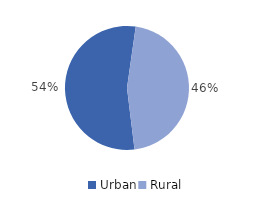
| Category | Series 0 |
|---|---|
| Urban | 54.2 |
| Rural | 45.8 |